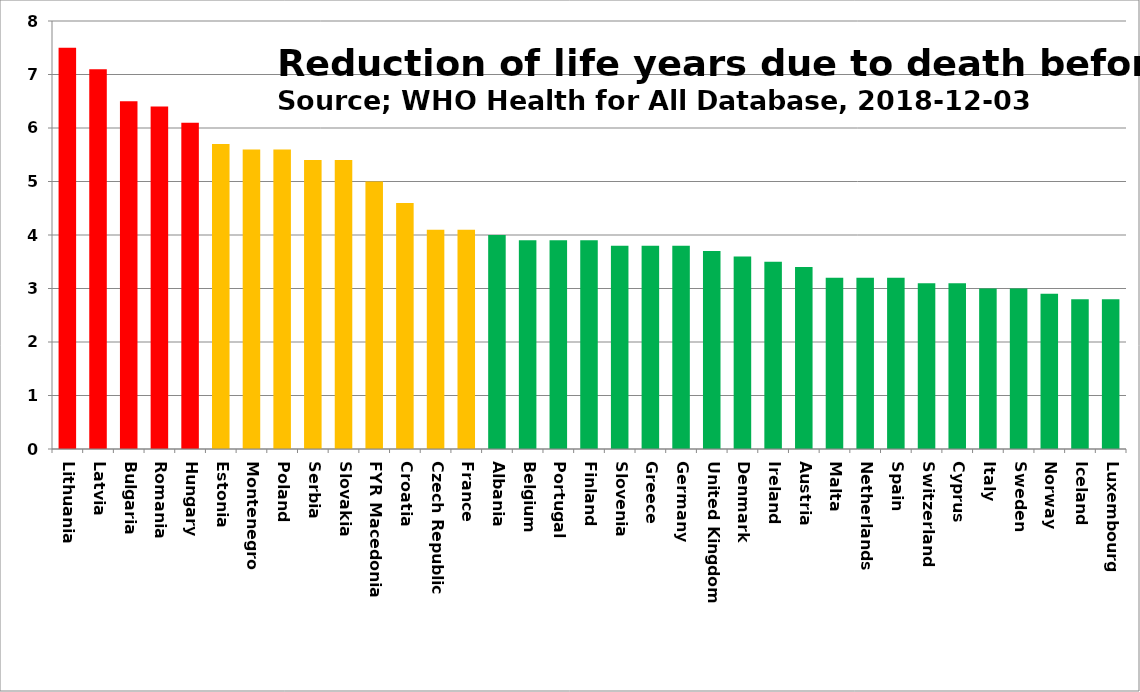
| Category | Series 0 |
|---|---|
| Lithuania | 7.5 |
| Latvia | 7.1 |
| Bulgaria | 6.5 |
| Romania | 6.4 |
| Hungary | 6.1 |
| Estonia | 5.7 |
| Montenegro | 5.6 |
| Poland | 5.6 |
| Serbia | 5.4 |
| Slovakia | 5.4 |
| FYR Macedonia | 5 |
| Croatia | 4.6 |
| Czech Republic | 4.1 |
| France | 4.1 |
| Albania | 4 |
| Belgium | 3.9 |
| Portugal | 3.9 |
| Finland | 3.9 |
| Slovenia | 3.8 |
| Greece | 3.8 |
| Germany | 3.8 |
| United Kingdom | 3.7 |
| Denmark | 3.6 |
| Ireland | 3.5 |
| Austria | 3.4 |
| Malta | 3.2 |
| Netherlands | 3.2 |
| Spain | 3.2 |
| Switzerland | 3.1 |
| Cyprus | 3.1 |
| Italy | 3 |
| Sweden | 3 |
| Norway | 2.9 |
| Iceland | 2.8 |
| Luxembourg | 2.8 |